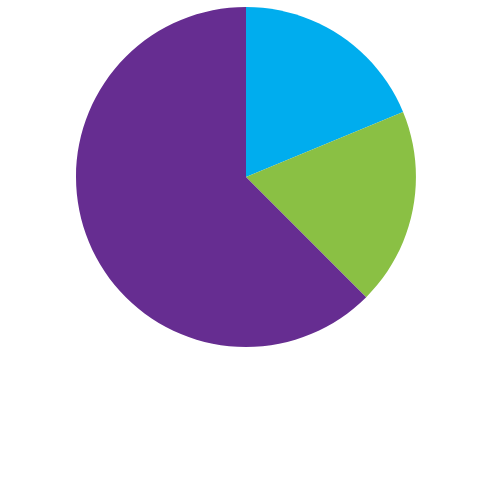
| Category | Series 0 |
|---|---|
| Cardio | 3 |
| Strength Training | 3 |
| Other Activities | 10 |